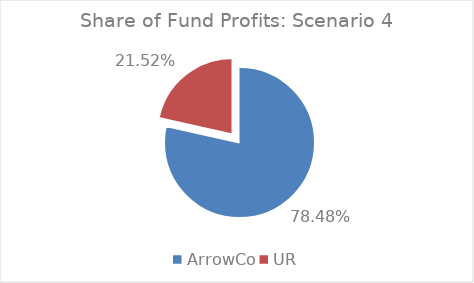
| Category | Series 0 |
|---|---|
| ArrowCo | 0.785 |
| UR | 0.215 |